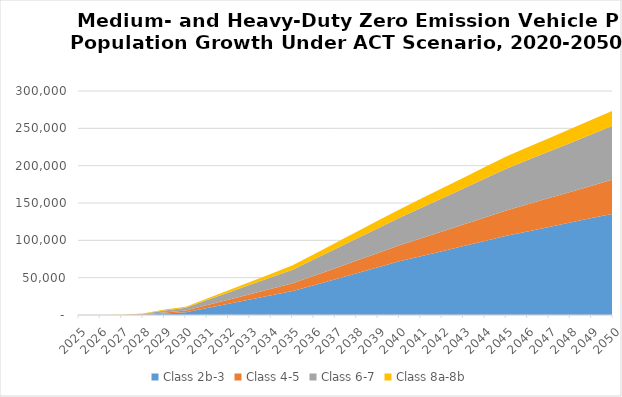
| Category | Class 2b-3 | Class 4-5 | Class 6-7 | Class 8a-8b |
|---|---|---|---|---|
| 2025.0 | 0 | 0 | 0 | 0 |
| 2026.0 | 0 | 0 | 0 | 0 |
| 2027.0 | 0 | 57.661 | 87.122 | 31.001 |
| 2028.0 | 428.1 | 528.698 | 875.736 | 311.712 |
| 2029.0 | 1912.519 | 1572.791 | 2676.183 | 1246.167 |
| 2030.0 | 3800 | 2180 | 3890 | 1060 |
| 2031.0 | 9444 | 3822 | 6778 | 2004 |
| 2032.0 | 15088 | 5464 | 9666 | 2948 |
| 2033.0 | 20732 | 7106 | 12554 | 3892 |
| 2034.0 | 26376 | 8748 | 15442 | 4836 |
| 2035.0 | 32020 | 10390 | 18330 | 5780 |
| 2036.0 | 39986 | 12592 | 22030 | 6894 |
| 2037.0 | 47952 | 14794 | 25730 | 8008 |
| 2038.0 | 55918 | 16996 | 29430 | 9122 |
| 2039.0 | 63884 | 19198 | 33130 | 10236 |
| 2040.0 | 71850 | 21400 | 36830 | 11350 |
| 2041.0 | 78690 | 23904 | 40652 | 12352 |
| 2042.0 | 85530 | 26408 | 44474 | 13354 |
| 2043.0 | 92370 | 28912 | 48296 | 14356 |
| 2044.0 | 99210 | 31416 | 52118 | 15358 |
| 2045.0 | 106050 | 33920 | 55940 | 16360 |
| 2046.0 | 111976 | 36296 | 59156 | 17132 |
| 2047.0 | 117902 | 38672 | 62372 | 17904 |
| 2048.0 | 123828 | 41048 | 65588 | 18676 |
| 2049.0 | 129754 | 43424 | 68804 | 19448 |
| 2050.0 | 135680 | 45800 | 72020 | 20220 |